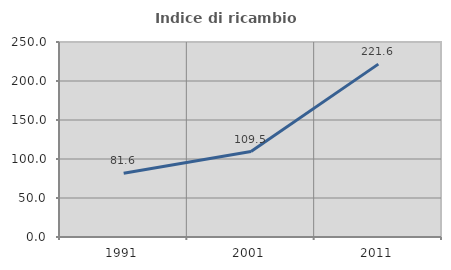
| Category | Indice di ricambio occupazionale  |
|---|---|
| 1991.0 | 81.624 |
| 2001.0 | 109.524 |
| 2011.0 | 221.642 |